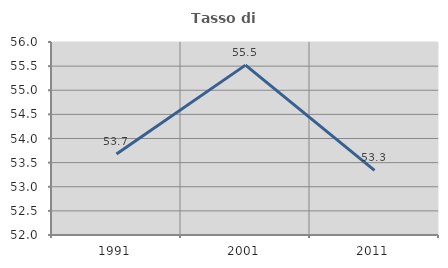
| Category | Tasso di occupazione   |
|---|---|
| 1991.0 | 53.678 |
| 2001.0 | 55.521 |
| 2011.0 | 53.339 |